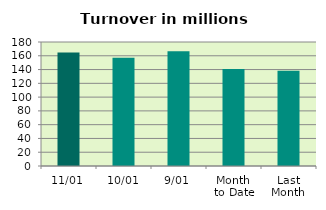
| Category | Series 0 |
|---|---|
| 11/01 | 164.764 |
| 10/01 | 157.276 |
| 9/01 | 166.624 |
| Month 
to Date | 140.865 |
| Last
Month | 138.201 |